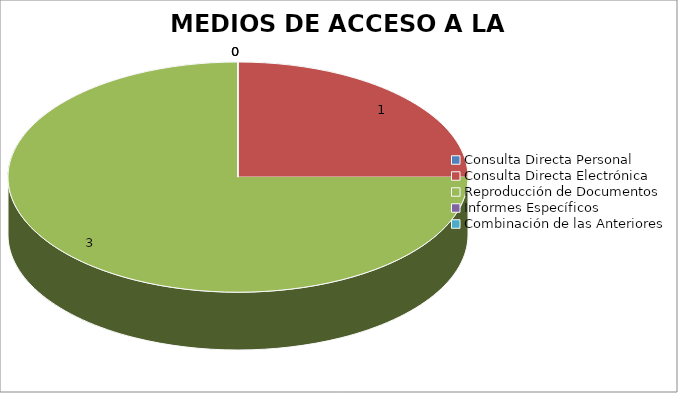
| Category | MEDIOS DE ACCESO A LA INFORMACIÓN |
|---|---|
| 0 | 0 |
| 1 | 1 |
| 2 | 3 |
| 3 | 0 |
| 4 | 0 |